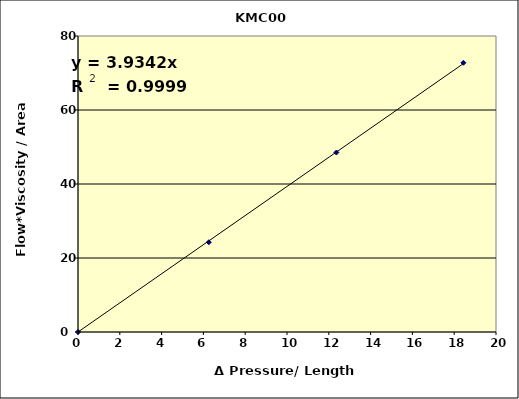
| Category | Series 0 |
|---|---|
| 0.0 | 0 |
| 6.2577291076124455 | 24.254 |
| 12.362072640961719 | 48.507 |
| 18.44080229500359 | 72.761 |